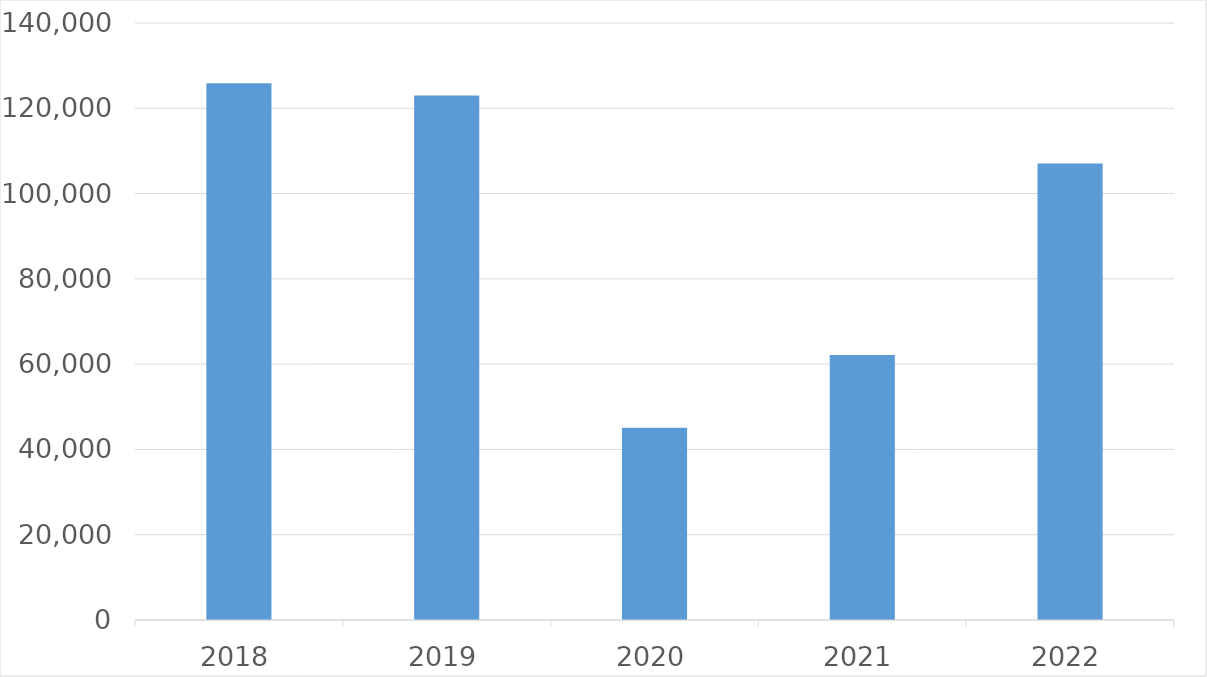
| Category | Series 0 |
|---|---|
| 2018 | 125847 |
| 2019 | 122993 |
| 2020 | 45089 |
| 2021 | 62115 |
| 2022 | 107049 |